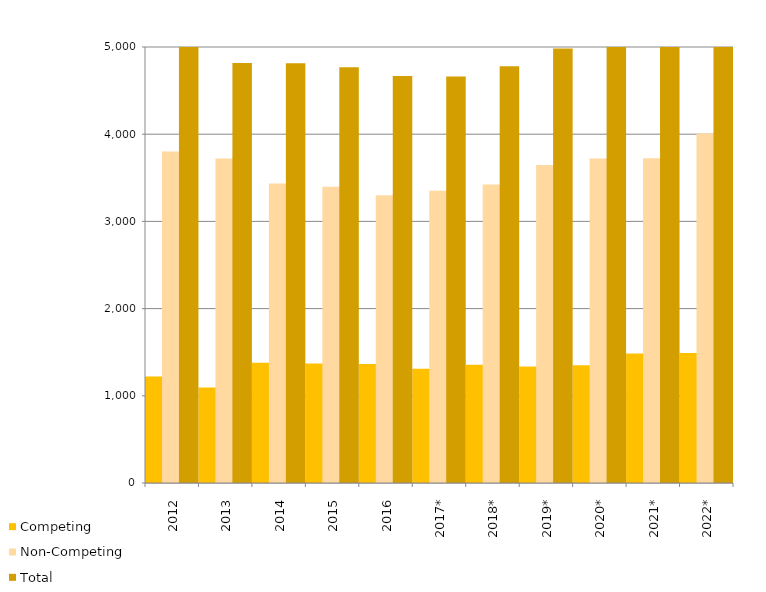
| Category | Competing  | Non-Competing    | Total |
|---|---|---|---|
| 2012 | 1220 | 3801 | 5021 |
| 2013 | 1095 | 3721 | 4816 |
| 2014 | 1378 | 3436 | 4814 |
| 2015 | 1371 | 3396 | 4767 |
| 2016 | 1365 | 3301 | 4666 |
| 2017* | 1311 | 3352 | 4663 |
| 2018* | 1356 | 3424 | 4780 |
| 2019* | 1336 | 3648 | 4984 |
| 2020* | 1350 | 3720 | 5070 |
| 2021* | 1486 | 3724 | 5210 |
| 2022* | 1490 | 4007 | 5497 |